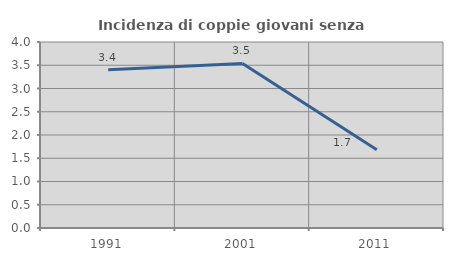
| Category | Incidenza di coppie giovani senza figli |
|---|---|
| 1991.0 | 3.402 |
| 2001.0 | 3.54 |
| 2011.0 | 1.683 |